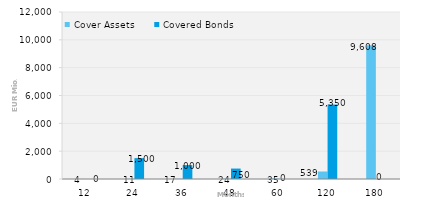
| Category | Cover Assets | Covered Bonds |
|---|---|---|
| 12.0 | 4.001 | 0 |
| 24.0 | 11.239 | 1500 |
| 36.0 | 16.895 | 1000 |
| 48.0 | 23.572 | 750 |
| 60.0 | 34.736 | 0 |
| 120.0 | 538.911 | 5350 |
| 180.0 | 9607.639 | 0 |